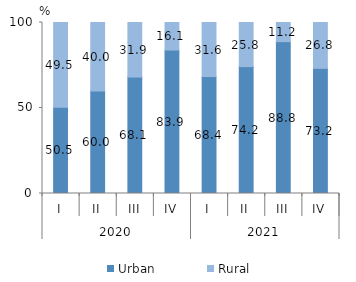
| Category | Urban | Rural |
|---|---|---|
| 0 | 50.5 | 49.5 |
| 1 | 60 | 40 |
| 2 | 68.1 | 31.9 |
| 3 | 83.9 | 16.1 |
| 4 | 68.4 | 31.6 |
| 5 | 74.2 | 25.8 |
| 6 | 88.8 | 11.2 |
| 7 | 73.2 | 26.8 |